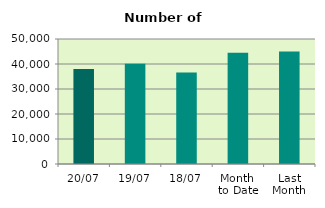
| Category | Series 0 |
|---|---|
| 20/07 | 38018 |
| 19/07 | 40116 |
| 18/07 | 36638 |
| Month 
to Date | 44491.714 |
| Last
Month | 45009.909 |